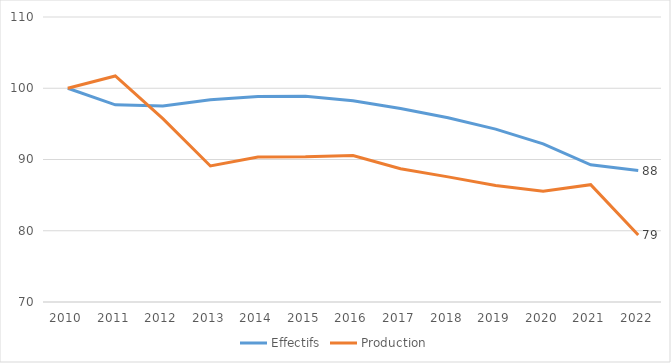
| Category | Effectifs |
|---|---|
| 2010.0 | 100 |
| 2011.0 | 97.669 |
| 2012.0 | 97.502 |
| 2013.0 | 98.383 |
| 2014.0 | 98.843 |
| 2015.0 | 98.865 |
| 2016.0 | 98.254 |
| 2017.0 | 97.144 |
| 2018.0 | 95.861 |
| 2019.0 | 94.258 |
| 2020.0 | 92.197 |
| 2021.0 | 89.253 |
| 2022.0 | 88.452 |